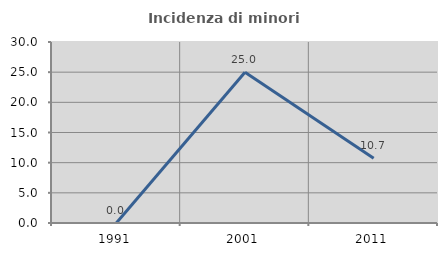
| Category | Incidenza di minori stranieri |
|---|---|
| 1991.0 | 0 |
| 2001.0 | 25 |
| 2011.0 | 10.714 |